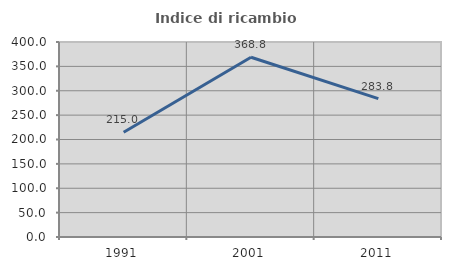
| Category | Indice di ricambio occupazionale  |
|---|---|
| 1991.0 | 215 |
| 2001.0 | 368.75 |
| 2011.0 | 283.784 |